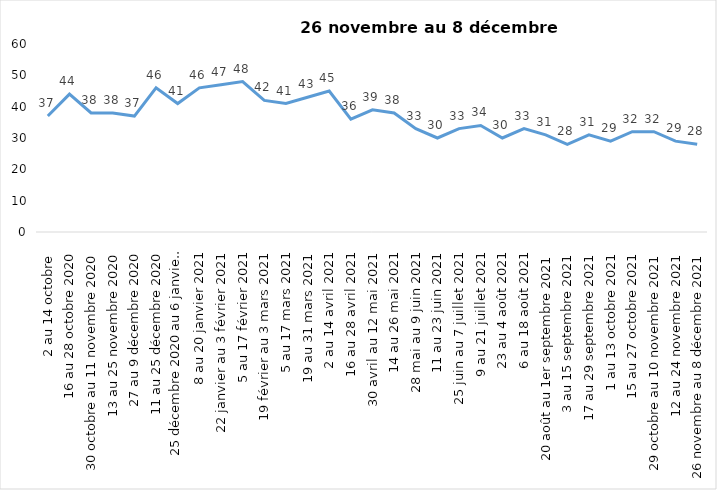
| Category | Toujours aux trois mesures |
|---|---|
| 2 au 14 octobre  | 37 |
| 16 au 28 octobre 2020 | 44 |
| 30 octobre au 11 novembre 2020 | 38 |
| 13 au 25 novembre 2020 | 38 |
| 27 au 9 décembre 2020 | 37 |
| 11 au 25 décembre 2020 | 46 |
| 25 décembre 2020 au 6 janvier 2021 | 41 |
| 8 au 20 janvier 2021 | 46 |
| 22 janvier au 3 février 2021 | 47 |
| 5 au 17 février 2021 | 48 |
| 19 février au 3 mars 2021 | 42 |
| 5 au 17 mars 2021 | 41 |
| 19 au 31 mars 2021 | 43 |
| 2 au 14 avril 2021 | 45 |
| 16 au 28 avril 2021 | 36 |
| 30 avril au 12 mai 2021 | 39 |
| 14 au 26 mai 2021 | 38 |
| 28 mai au 9 juin 2021 | 33 |
| 11 au 23 juin 2021 | 30 |
| 25 juin au 7 juillet 2021 | 33 |
| 9 au 21 juillet 2021 | 34 |
| 23 au 4 août 2021 | 30 |
| 6 au 18 août 2021 | 33 |
| 20 août au 1er septembre 2021 | 31 |
| 3 au 15 septembre 2021 | 28 |
| 17 au 29 septembre 2021 | 31 |
| 1 au 13 octobre 2021 | 29 |
| 15 au 27 octobre 2021 | 32 |
| 29 octobre au 10 novembre 2021 | 32 |
| 12 au 24 novembre 2021 | 29 |
| 26 novembre au 8 décembre 2021 | 28 |